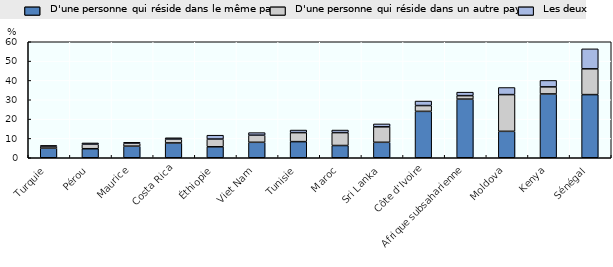
| Category | D'une personne qui réside dans le même pays | D'une personne qui réside dans un autre pays | Les deux |
|---|---|---|---|
| Turquie | 5 | 1 | 0.333 |
| Pérou | 4.667 | 2.333 | 0.667 |
| Maurice | 6 | 1.5 | 0.5 |
| Costa Rica | 7.667 | 2 | 0.667 |
| Éthiopie | 5.667 | 4 | 2 |
| Viet Nam | 8 | 3.667 | 1.333 |
| Tunisie | 8.333 | 4.667 | 1.333 |
| Maroc | 6.333 | 6.667 | 1.333 |
| Sri Lanka | 8 | 8 | 1.5 |
| Côte d'Ivoire | 24 | 3 | 2.333 |
| Afrique subsaharienne | 30.333 | 1.8 | 1.8 |
| Moldova | 13.667 | 19 | 3.667 |
| Kenya | 33 | 3.667 | 3.333 |
| Sénégal | 32.667 | 13.333 | 10.333 |